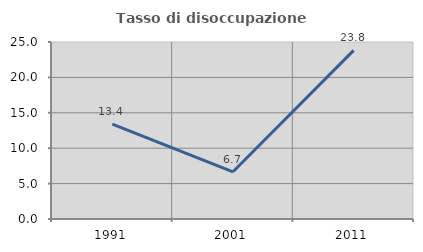
| Category | Tasso di disoccupazione giovanile  |
|---|---|
| 1991.0 | 13.415 |
| 2001.0 | 6.667 |
| 2011.0 | 23.81 |